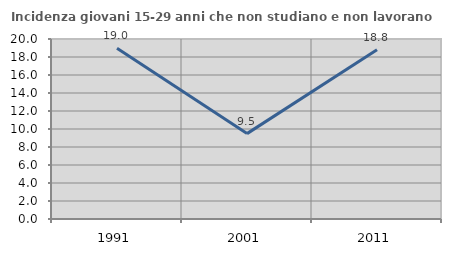
| Category | Incidenza giovani 15-29 anni che non studiano e non lavorano  |
|---|---|
| 1991.0 | 18.965 |
| 2001.0 | 9.487 |
| 2011.0 | 18.814 |